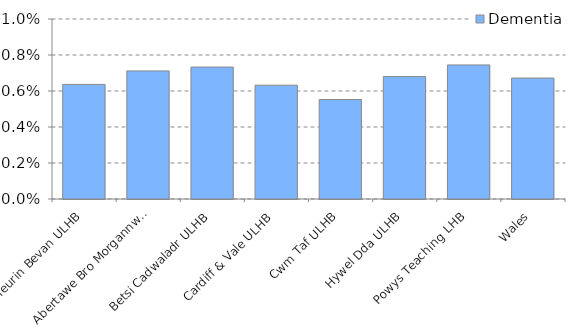
| Category | Dementia |
|---|---|
| Aneurin Bevan ULHB | 0.006 |
| Abertawe Bro Morgannwg ULHB | 0.007 |
| Betsi Cadwaladr ULHB | 0.007 |
| Cardiff & Vale ULHB | 0.006 |
| Cwm Taf ULHB | 0.006 |
| Hywel Dda ULHB | 0.007 |
| Powys Teaching LHB | 0.007 |
| Wales | 0.007 |